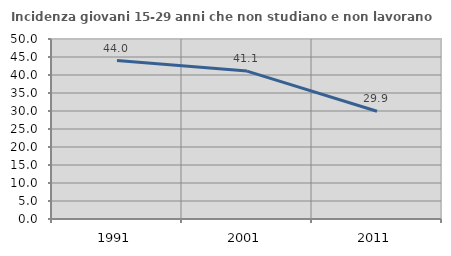
| Category | Incidenza giovani 15-29 anni che non studiano e non lavorano  |
|---|---|
| 1991.0 | 44.011 |
| 2001.0 | 41.084 |
| 2011.0 | 29.94 |